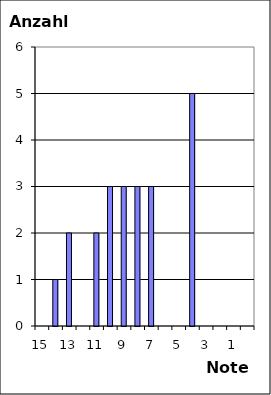
| Category | Series 0 |
|---|---|
| 15.0 | 0 |
| 14.0 | 1 |
| 13.0 | 2 |
| 12.0 | 0 |
| 11.0 | 2 |
| 10.0 | 3 |
| 9.0 | 3 |
| 8.0 | 3 |
| 7.0 | 3 |
| 6.0 | 0 |
| 5.0 | 0 |
| 4.0 | 5 |
| 3.0 | 0 |
| 2.0 | 0 |
| 1.0 | 0 |
| 0.0 | 0 |